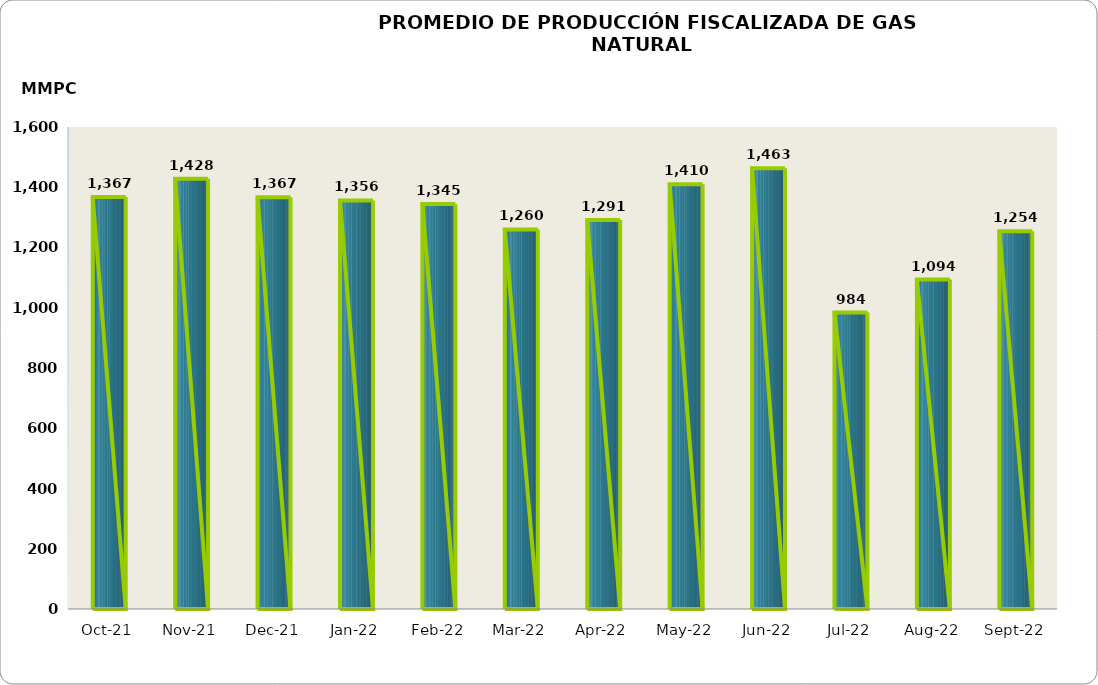
| Category | Series 0 |
|---|---|
| 2021-10-01 | 1367318.609 |
| 2021-11-01 | 1428097.616 |
| 2021-12-01 | 1366833.527 |
| 2022-01-01 | 1356402.082 |
| 2022-02-01 | 1344504.622 |
| 2022-03-01 | 1259914.198 |
| 2022-04-01 | 1291170.944 |
| 2022-05-01 | 1410361.644 |
| 2022-06-01 | 1462840.082 |
| 2022-07-01 | 983913.442 |
| 2022-08-01 | 1093528.82 |
| 2022-09-01 | 1253987.9 |